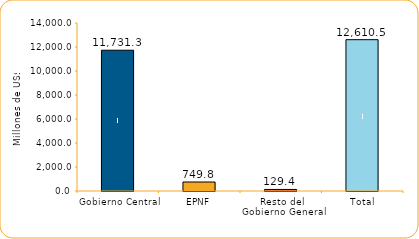
| Category | Series 1 |
|---|---|
| Gobierno Central | 11731.3 |
| EPNF | 749.8 |
| Resto del Gobierno General | 129.4 |
| Total | 12610.5 |